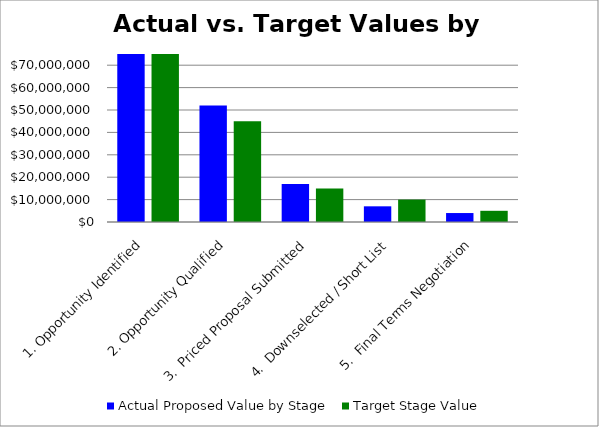
| Category | Actual Proposed Value by Stage | Target Stage Value  |
|---|---|---|
| 1. Opportunity Identified | 115000000 | 135000000 |
| 2. Opportunity Qualified | 52000000 | 45000000 |
| 3.  Priced Proposal Submitted | 17000000 | 15000000 |
| 4.  Downselected / Short List | 7000000 | 10000000 |
| 5.  Final Terms Negotiation | 4000000 | 5000000 |